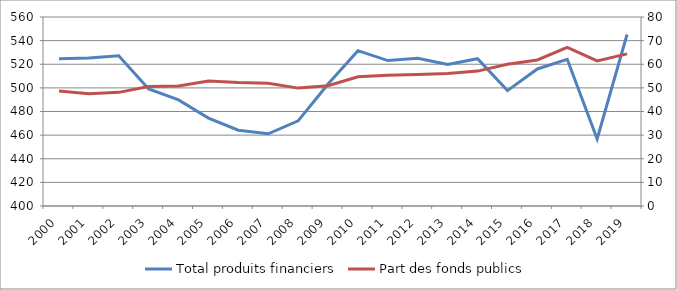
| Category | Total produits financiers |
|---|---|
| 2000.0 | 524.7 |
| 2001.0 | 525.3 |
| 2002.0 | 527.2 |
| 2003.0 | 499.1 |
| 2004.0 | 489.8 |
| 2005.0 | 474.4 |
| 2006.0 | 464.2 |
| 2007.0 | 461.1 |
| 2008.0 | 472.1 |
| 2009.0 | 503.2 |
| 2010.0 | 531.5 |
| 2011.0 | 523.1 |
| 2012.0 | 525.1 |
| 2013.0 | 519.9 |
| 2014.0 | 524.7 |
| 2015.0 | 497.7 |
| 2016.0 | 516 |
| 2017.0 | 524.2 |
| 2018.0 | 456.8 |
| 2019.0 | 545.2 |